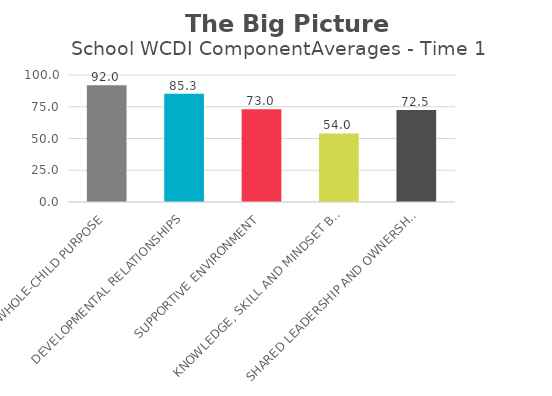
| Category | Series 0 |
|---|---|
| WHOLE-CHILD PURPOSE | 92 |
| DEVELOPMENTAL RELATIONSHIPS | 85.3 |
| SUPPORTIVE ENVIRONMENT | 73 |
| KNOWLEDGE, SKILL AND MINDSET BUILDING | 54 |
| SHARED LEADERSHIP AND OWNERSHIP | 72.5 |